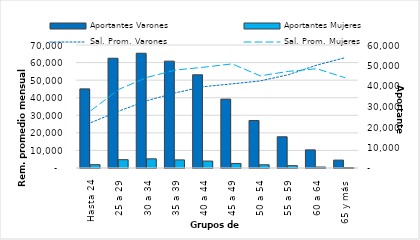
| Category | Aportantes Varones | Aportantes Mujeres |
|---|---|---|
| Hasta 24 | 38594 | 1619 |
| 25 a 29 | 53539 | 4070 |
| 30 a 34 | 55976 | 4471 |
| 35 a 39 | 52121 | 3951 |
| 40 a 44 | 45476 | 3398 |
| 45 a 49 | 33612 | 2212 |
| 50 a 54 | 23168 | 1572 |
| 55 a 59 | 15231 | 1143 |
| 60 a 64 | 8842 | 466 |
| 65 y más | 3854 | 250 |